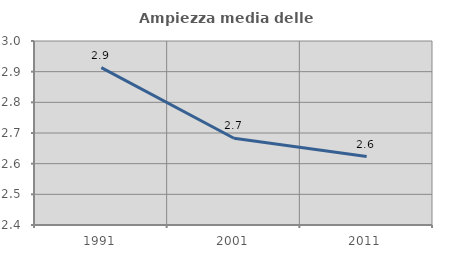
| Category | Ampiezza media delle famiglie |
|---|---|
| 1991.0 | 2.913 |
| 2001.0 | 2.683 |
| 2011.0 | 2.623 |